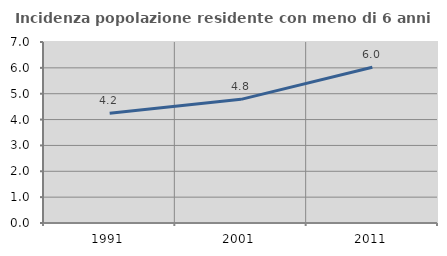
| Category | Incidenza popolazione residente con meno di 6 anni |
|---|---|
| 1991.0 | 4.244 |
| 2001.0 | 4.782 |
| 2011.0 | 6.02 |